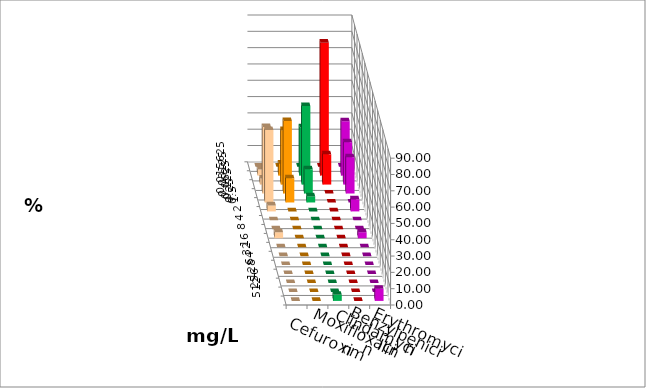
| Category | Cefuroxim | Moxifloxacin | Clindamycin | Benzylpenicillin | Erythromycin |
|---|---|---|---|---|---|
| 0.015625 | 0 | 0 | 0 | 0 | 0 |
| 0.03125 | 3.704 | 7.407 | 29.63 | 81.481 | 33.333 |
| 0.0625 | 3.704 | 33.333 | 48.148 | 18.519 | 25.926 |
| 0.125 | 40.741 | 44.444 | 14.815 | 0 | 22.222 |
| 0.25 | 44.444 | 14.815 | 3.704 | 0 | 0 |
| 0.5 | 3.704 | 0 | 0 | 0 | 7.407 |
| 1.0 | 0 | 0 | 0 | 0 | 0 |
| 2.0 | 0 | 0 | 0 | 0 | 0 |
| 4.0 | 3.704 | 0 | 0 | 0 | 3.704 |
| 8.0 | 0 | 0 | 0 | 0 | 0 |
| 16.0 | 0 | 0 | 0 | 0 | 0 |
| 32.0 | 0 | 0 | 0 | 0 | 0 |
| 64.0 | 0 | 0 | 0 | 0 | 0 |
| 128.0 | 0 | 0 | 0 | 0 | 0 |
| 256.0 | 0 | 0 | 0 | 0 | 0 |
| 512.0 | 0 | 0 | 3.704 | 0 | 7.407 |